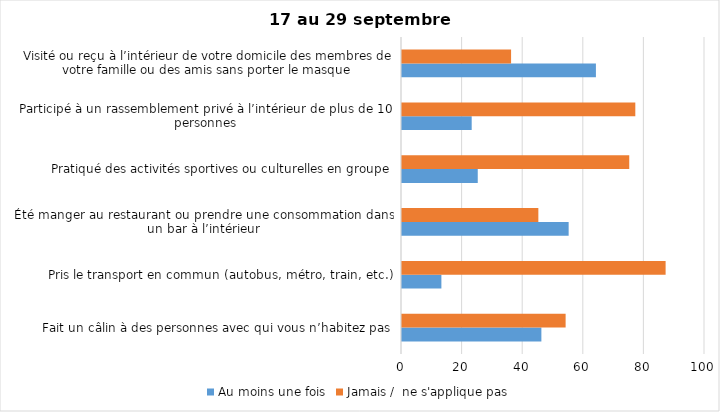
| Category | Au moins une fois | Jamais /  ne s'applique pas |
|---|---|---|
| Fait un câlin à des personnes avec qui vous n’habitez pas | 46 | 54 |
| Pris le transport en commun (autobus, métro, train, etc.) | 13 | 87 |
| Été manger au restaurant ou prendre une consommation dans un bar à l’intérieur | 55 | 45 |
| Pratiqué des activités sportives ou culturelles en groupe | 25 | 75 |
| Participé à un rassemblement privé à l’intérieur de plus de 10 personnes | 23 | 77 |
| Visité ou reçu à l’intérieur de votre domicile des membres de votre famille ou des amis sans porter le masque | 64 | 36 |